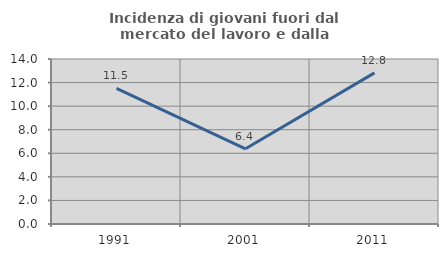
| Category | Incidenza di giovani fuori dal mercato del lavoro e dalla formazione  |
|---|---|
| 1991.0 | 11.511 |
| 2001.0 | 6.383 |
| 2011.0 | 12.821 |